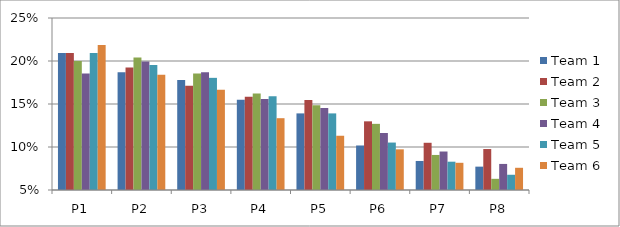
| Category | Team 1 | Team 2 | Team 3 | Team 4 | Team 5 | Team 6 |
|---|---|---|---|---|---|---|
| P1 | 0.209 | 0.209 | 0.2 | 0.186 | 0.209 | 0.219 |
| P2 | 0.187 | 0.193 | 0.204 | 0.199 | 0.195 | 0.184 |
| P3 | 0.178 | 0.171 | 0.186 | 0.187 | 0.18 | 0.167 |
| P4 | 0.155 | 0.158 | 0.162 | 0.156 | 0.159 | 0.133 |
| P5 | 0.139 | 0.155 | 0.149 | 0.145 | 0.139 | 0.113 |
| P6 | 0.102 | 0.13 | 0.127 | 0.116 | 0.105 | 0.097 |
| P7 | 0.084 | 0.105 | 0.091 | 0.095 | 0.083 | 0.082 |
| P8 | 0.077 | 0.098 | 0.063 | 0.08 | 0.068 | 0.076 |